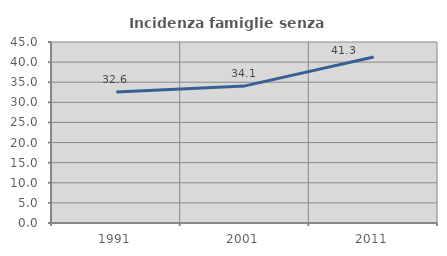
| Category | Incidenza famiglie senza nuclei |
|---|---|
| 1991.0 | 32.59 |
| 2001.0 | 34.091 |
| 2011.0 | 41.27 |